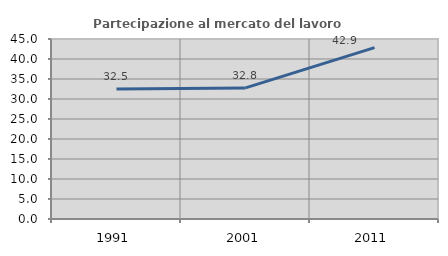
| Category | Partecipazione al mercato del lavoro  femminile |
|---|---|
| 1991.0 | 32.479 |
| 2001.0 | 32.78 |
| 2011.0 | 42.857 |